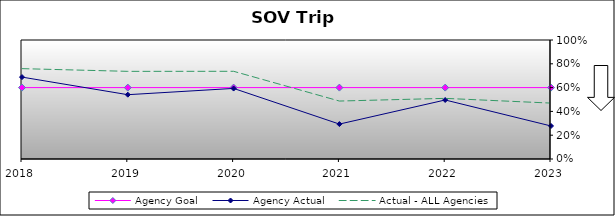
| Category | Agency Goal | Agency Actual | Actual - ALL Agencies |
|---|---|---|---|
| 2018.0 | 0.6 | 0.688 | 0.759 |
| 2019.0 | 0.6 | 0.54 | 0.736 |
| 2020.0 | 0.6 | 0.593 | 0.737 |
| 2021.0 | 0.6 | 0.293 | 0.487 |
| 2022.0 | 0.6 | 0.496 | 0.509 |
| 2023.0 | 0.6 | 0.278 | 0.47 |